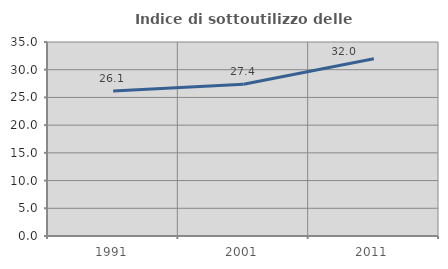
| Category | Indice di sottoutilizzo delle abitazioni  |
|---|---|
| 1991.0 | 26.14 |
| 2001.0 | 27.362 |
| 2011.0 | 31.977 |